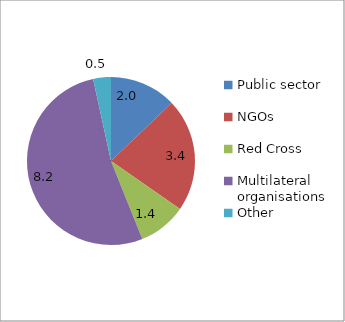
| Category | 2010 |
|---|---|
| Public sector | 1.993 |
| NGOs  | 3.384 |
| Red Cross | 1.439 |
| Multilateral organisations | 8.171 |
| Other | 0.53 |